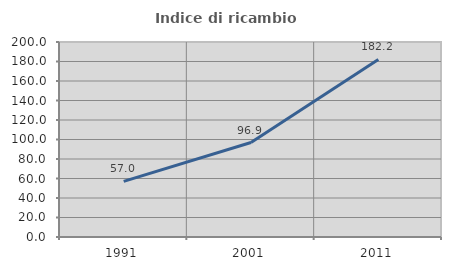
| Category | Indice di ricambio occupazionale  |
|---|---|
| 1991.0 | 57.048 |
| 2001.0 | 96.915 |
| 2011.0 | 182.164 |